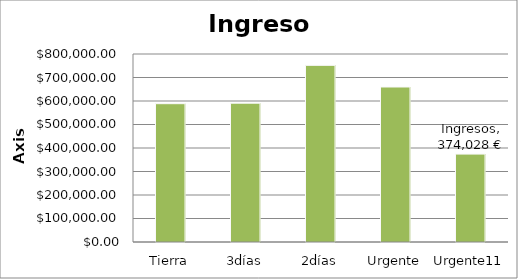
| Category | Ingresos |
|---|---|
| Tierra | 588528 |
| 3días | 590634 |
| 2días | 751622 |
| Urgente | 659558 |
| Urgente11 | 374028 |